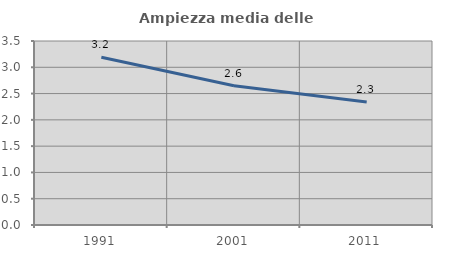
| Category | Ampiezza media delle famiglie |
|---|---|
| 1991.0 | 3.19 |
| 2001.0 | 2.648 |
| 2011.0 | 2.338 |